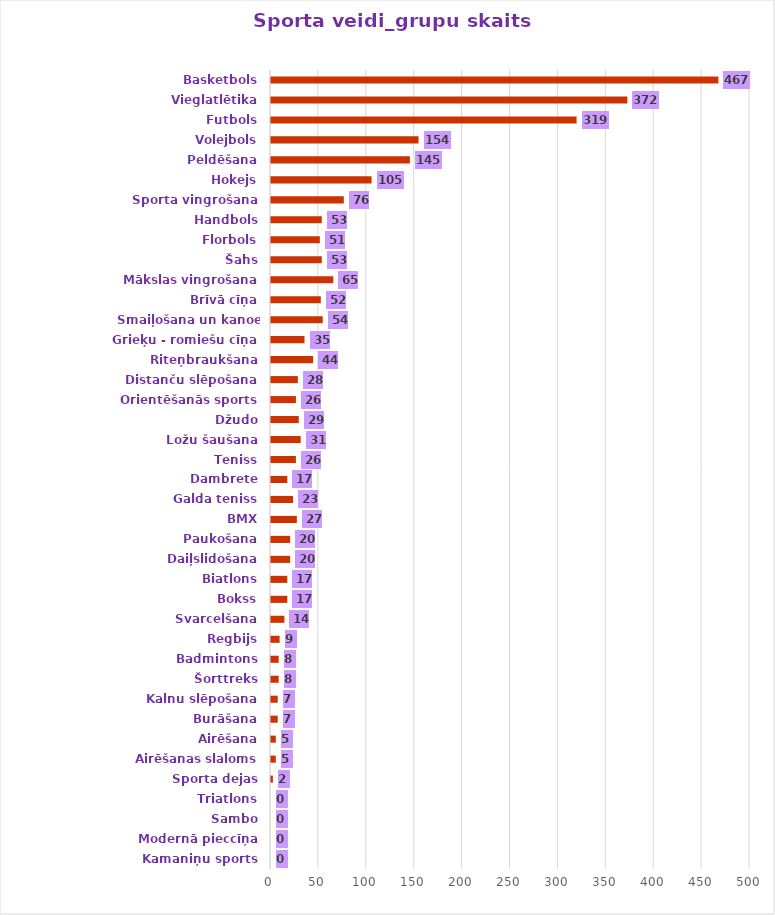
| Category | Grupu
 skaits |
|---|---|
| Kamaniņu sports | 0 |
| Modernā pieccīņa | 0 |
| Sambo | 0 |
| Triatlons | 0 |
| Sporta dejas | 2 |
| Airēšanas slaloms | 5 |
| Airēšana | 5 |
| Burāšana | 7 |
| Kalnu slēpošana | 7 |
| Šorttreks | 8 |
| Badmintons | 8 |
| Regbijs | 9 |
| Svarcelšana | 14 |
| Bokss | 17 |
| Biatlons | 17 |
| Daiļslidošana | 20 |
| Paukošana | 20 |
| BMX | 27 |
| Galda teniss | 23 |
| Dambrete | 17 |
| Teniss | 26 |
| Ložu šaušana | 31 |
| Džudo | 29 |
| Orientēšanās sports | 26 |
| Distanču slēpošana | 28 |
| Riteņbraukšana | 44 |
| Grieķu - romiešu cīņa | 35 |
| Smaiļošana un kanoe airēšana | 54 |
| Brīvā cīņa | 52 |
| Mākslas vingrošana | 65 |
| Šahs | 53 |
| Florbols | 51 |
| Handbols | 53 |
| Sporta vingrošana | 76 |
| Hokejs | 105 |
| Peldēšana | 145 |
| Volejbols | 154 |
| Futbols | 319 |
| Vieglatlētika | 372 |
| Basketbols | 467 |